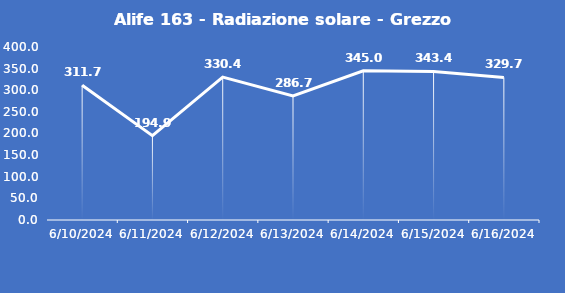
| Category | Alife 163 - Radiazione solare - Grezzo (W/m2) |
|---|---|
| 6/10/24 | 311.7 |
| 6/11/24 | 194.9 |
| 6/12/24 | 330.4 |
| 6/13/24 | 286.7 |
| 6/14/24 | 345 |
| 6/15/24 | 343.4 |
| 6/16/24 | 329.7 |